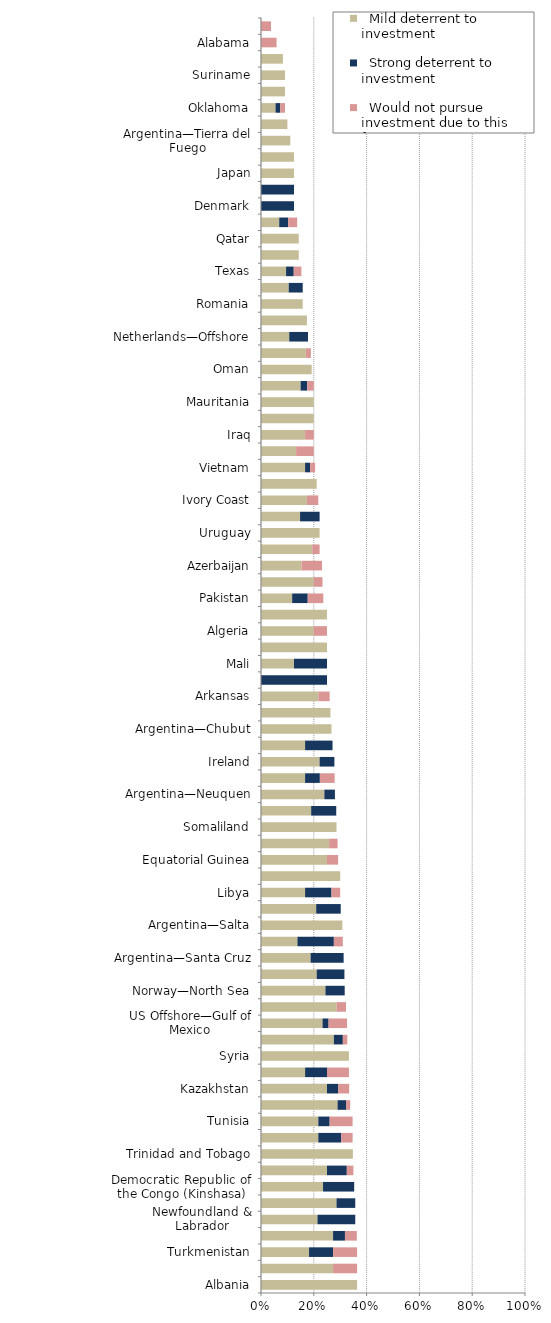
| Category |   Mild deterrent to investment |   Strong deterrent to investment |   Would not pursue investment due to this factor |
|---|---|---|---|
| Albania | 0.364 | 0 | 0 |
| Cambodia | 0.273 | 0 | 0.091 |
| Turkmenistan | 0.182 | 0.091 | 0.091 |
| Northern Territory | 0.273 | 0.045 | 0.045 |
| Newfoundland & Labrador | 0.214 | 0.143 | 0 |
| Republic of the Congo (Brazzaville) | 0.286 | 0.071 | 0 |
| Democratic Republic of the Congo (Kinshasa) | 0.235 | 0.118 | 0 |
| Gabon | 0.25 | 0.075 | 0.025 |
| Trinidad and Tobago | 0.348 | 0 | 0 |
| Michigan | 0.217 | 0.087 | 0.043 |
| Tunisia | 0.217 | 0.043 | 0.087 |
| Thailand | 0.29 | 0.032 | 0.016 |
| Kazakhstan | 0.25 | 0.042 | 0.042 |
| Iran | 0.167 | 0.083 | 0.083 |
| Syria | 0.333 | 0 | 0 |
| Louisiana | 0.276 | 0.034 | 0.017 |
| US Offshore—Gulf of Mexico | 0.233 | 0.023 | 0.07 |
| Philippines | 0.286 | 0 | 0.036 |
| Norway—North Sea | 0.244 | 0.073 | 0 |
| West Virginia | 0.211 | 0.105 | 0 |
| Argentina—Santa Cruz | 0.188 | 0.125 | 0 |
| China | 0.138 | 0.138 | 0.034 |
| Argentina—Salta | 0.308 | 0 | 0 |
| United Kingdom—North Sea | 0.209 | 0.093 | 0 |
| Libya | 0.167 | 0.1 | 0.033 |
| Malta | 0.3 | 0 | 0 |
| Equatorial Guinea | 0.25 | 0 | 0.042 |
| Papua New Guinea | 0.258 | 0 | 0.032 |
| Somaliland | 0.286 | 0 | 0 |
| Timor Gap (JPDA) | 0.19 | 0.095 | 0 |
| Argentina—Neuquen | 0.24 | 0.04 | 0 |
| Namibia | 0.167 | 0.056 | 0.056 |
| Ireland | 0.222 | 0.056 | 0 |
| Alberta | 0.167 | 0.104 | 0 |
| Argentina—Chubut | 0.267 | 0 | 0 |
| Morocco | 0.263 | 0 | 0 |
| Arkansas | 0.217 | 0 | 0.043 |
| Kyrgyzstan | 0 | 0.25 | 0 |
| Mali | 0.125 | 0.125 | 0 |
| South Sudan | 0.25 | 0 | 0 |
| Algeria | 0.2 | 0 | 0.05 |
| Bahrain | 0.25 | 0 | 0 |
| Pakistan | 0.118 | 0.059 | 0.059 |
| Ghana | 0.2 | 0 | 0.033 |
| Azerbaijan | 0.154 | 0 | 0.077 |
| Kansas | 0.194 | 0 | 0.028 |
| Uruguay | 0.222 | 0 | 0 |
| Ohio | 0.148 | 0.074 | 0 |
| Ivory Coast | 0.174 | 0 | 0.043 |
| Illinois | 0.211 | 0 | 0 |
| Vietnam | 0.167 | 0.019 | 0.019 |
| Nigeria | 0.133 | 0 | 0.067 |
| Iraq | 0.167 | 0 | 0.033 |
| Kuwait | 0.2 | 0 | 0 |
| Mauritania | 0.2 | 0 | 0 |
| Malaysia | 0.15 | 0.025 | 0.025 |
| Oman | 0.192 | 0 | 0 |
| North Dakota | 0.17 | 0 | 0.019 |
| Netherlands—Offshore | 0.107 | 0.071 | 0 |
| Brunei | 0.174 | 0 | 0 |
| Romania | 0.158 | 0 | 0 |
| Yemen | 0.105 | 0.053 | 0 |
| Texas | 0.095 | 0.029 | 0.029 |
| Saskatchewan | 0.143 | 0 | 0 |
| Qatar | 0.143 | 0 | 0 |
| Angola | 0.069 | 0.034 | 0.034 |
| Denmark | 0 | 0.125 | 0 |
| Faroe Islands | 0 | 0.125 | 0 |
| Japan | 0.125 | 0 | 0 |
| Jordan | 0.125 | 0 | 0 |
| Argentina—Tierra del Fuego | 0.111 | 0 | 0 |
| Manitoba | 0.1 | 0 | 0 |
| Oklahoma | 0.055 | 0.018 | 0.018 |
| United Arab Emirates | 0.091 | 0 | 0 |
| Suriname | 0.091 | 0 | 0 |
| Guyana | 0.083 | 0 | 0 |
| Alabama | 0 | 0 | 0.059 |
| Mississippi | 0 | 0 | 0.038 |